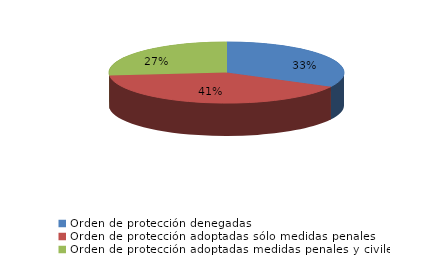
| Category | Series 0 |
|---|---|
| Orden de protección denegadas | 32 |
| Orden de protección adoptadas sólo medidas penales | 40 |
| Orden de protección adoptadas medidas penales y civiles | 26 |